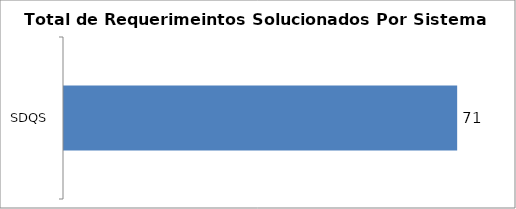
| Category | Total |
|---|---|
| SDQS | 71 |